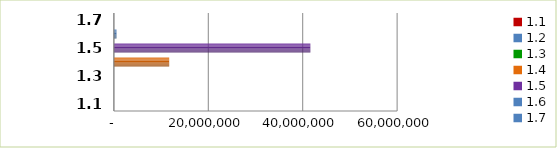
| Category | Series 0 |
|---|---|
| 1.1 | 0 |
| 1.2 | 0 |
| 1.3 | 0 |
| 1.4 | 11713711.48 |
| 1.5 | 41618704.09 |
| 1.6 | 554843 |
| 1.7 | 0 |